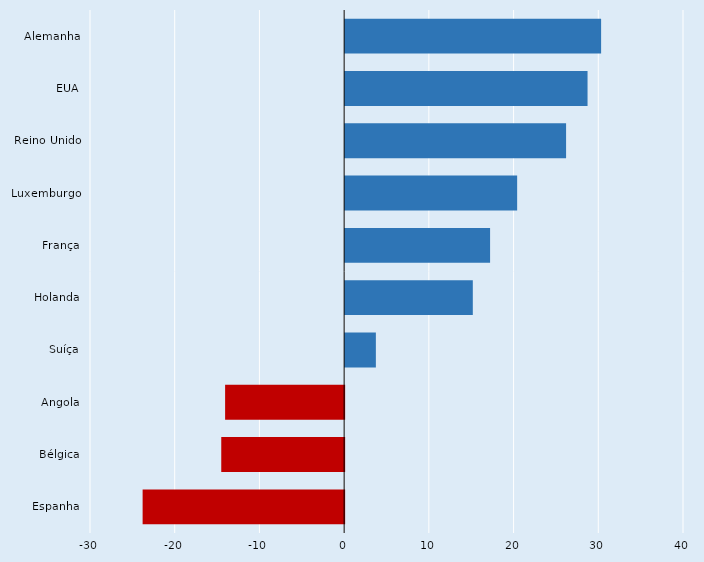
| Category | Series 0 |
|---|---|
| Alemanha | 30.216 |
| EUA | 28.614 |
| Reino Unido | 26.081 |
| Luxemburgo | 20.305 |
| França | 17.11 |
| Holanda | 15.07 |
| Suíça | 3.627 |
| Angola | -14.051 |
| Bélgica | -14.506 |
| Espanha | -23.788 |